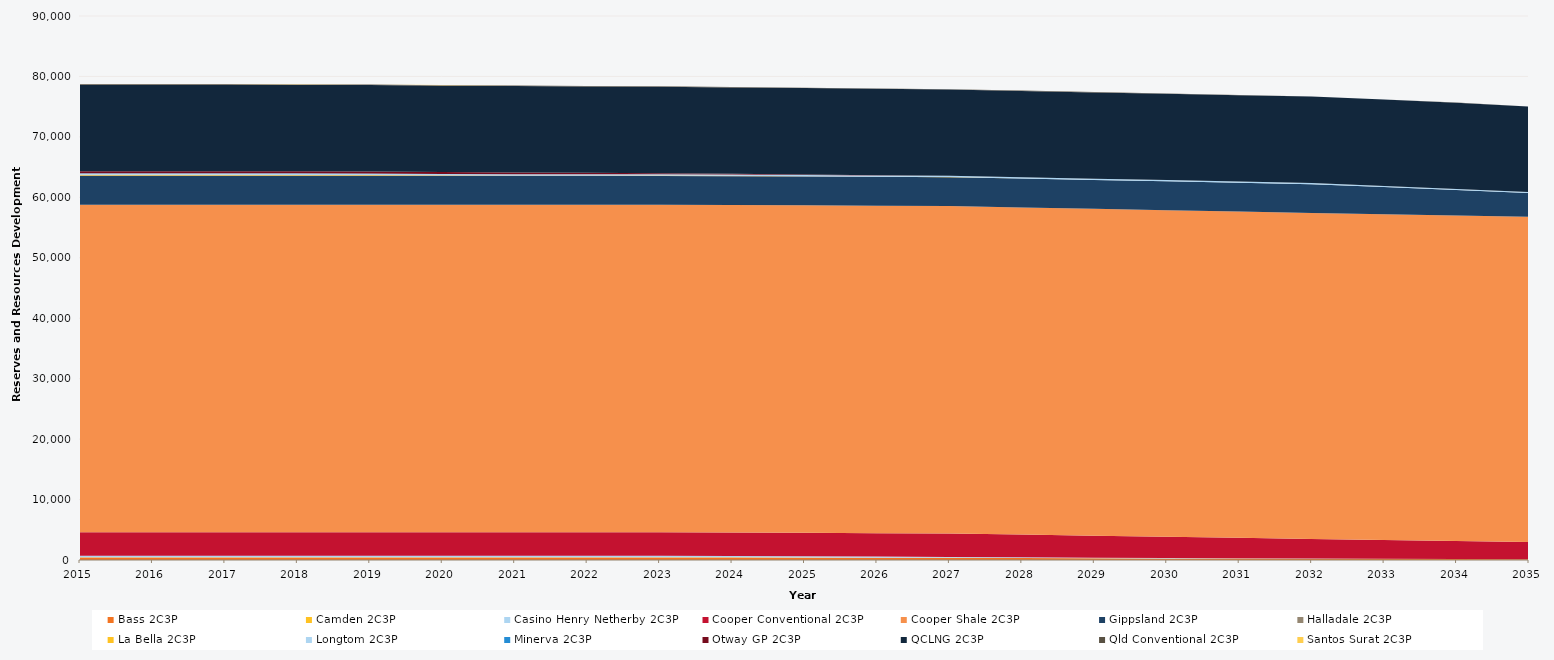
| Category | Bass 2C3P | Camden 2C3P | Casino Henry Netherby 2C3P | Cooper Conventional 2C3P | Cooper Shale 2C3P | Gippsland 2C3P | Halladale 2C3P | La Bella 2C3P | Longtom 2C3P | Minerva 2C3P | Otway GP 2C3P | QCLNG 2C3P | Qld Conventional 2C3P | Santos Surat 2C3P |
|---|---|---|---|---|---|---|---|---|---|---|---|---|---|---|
| 2015.0 | 409.522 | 36 | 273.008 | 3883.683 | 54170.916 | 4777.394 | 44 | 126.4 | 208.266 | 66.247 | 328.425 | 14279 | 88.984 | 30.64 |
| 2016.0 | 409.522 | 36 | 273.008 | 3883.683 | 54170.916 | 4777.394 | 44 | 126.4 | 208.266 | 66.247 | 328.425 | 14279 | 88.984 | 30.64 |
| 2017.0 | 409.522 | 36 | 273.008 | 3883.683 | 54170.916 | 4777.394 | 44 | 126.4 | 208.266 | 66.247 | 328.425 | 14279 | 88.984 | 30.64 |
| 2018.0 | 409.522 | 36 | 273.008 | 3883.683 | 54170.916 | 4777.394 | 44 | 120.433 | 208.266 | 66.247 | 328.425 | 14279 | 88.984 | 30.64 |
| 2019.0 | 409.522 | 36 | 273.008 | 3883.683 | 54170.916 | 4777.394 | 44 | 90.868 | 208.191 | 66.247 | 328.425 | 14279 | 88.984 | 30.64 |
| 2020.0 | 409.522 | 36 | 273.008 | 3883.683 | 54170.916 | 4776.045 | 44 | 61.303 | 208.041 | 0 | 328.425 | 14279 | 88.984 | 20.893 |
| 2021.0 | 409.522 | 36 | 273.008 | 3883.683 | 54170.916 | 4775.524 | 44 | 25.726 | 207.977 | 0 | 295.527 | 14279 | 88.984 | 9.913 |
| 2022.0 | 409.522 | 36 | 273.008 | 3883.683 | 54170.916 | 4775.524 | 44 | 20.002 | 207.869 | 0 | 243.487 | 14279 | 88.984 | 0 |
| 2023.0 | 409.522 | 36 | 264.908 | 3883.683 | 54170.916 | 4774.95 | 39.701 | 16.842 | 207.84 | 0 | 192.979 | 14279 | 88.984 | 0 |
| 2024.0 | 409.522 | 31.695 | 235.708 | 3883.683 | 54170.916 | 4774.95 | 29.155 | 16.265 | 207.802 | 0 | 146.524 | 14279 | 88.396 | 0 |
| 2025.0 | 385.947 | 26.205 | 206.428 | 3883.683 | 54170.916 | 4774.597 | 29.155 | 6.993 | 207.802 | 0 | 98.153 | 14279 | 80.344 | 0 |
| 2026.0 | 361.492 | 20.73 | 177.228 | 3883.683 | 54170.916 | 4774.56 | 16.174 | 6.229 | 207.802 | 0 | 54.284 | 14279 | 72.314 | 0 |
| 2027.0 | 337.037 | 15.255 | 148.028 | 3883.683 | 54170.916 | 4774.56 | 9.819 | 5.399 | 207.606 | 0 | 2.182 | 14279 | 64.284 | 0 |
| 2028.0 | 312.582 | 9.78 | 118.828 | 3765.688 | 54124.435 | 4772.22 | 6.73 | 0 | 207.398 | 0 | 2.182 | 14279 | 56.254 | 0 |
| 2029.0 | 288.06 | 4.29 | 89.548 | 3632.092 | 54081.797 | 4770.395 | 5.868 | 0 | 207.398 | 0 | 2.179 | 14279 | 48.202 | 0 |
| 2030.0 | 263.605 | 2.76 | 73.666 | 3499.652 | 54035.387 | 4770.395 | 3.627 | 0 | 207.377 | 0 | 1.916 | 14279 | 40.172 | 0 |
| 2031.0 | 239.15 | 1.38 | 54.625 | 3374.232 | 53981.957 | 4770.374 | 0 | 0 | 207.377 | 0 | 0.115 | 14279 | 32.142 | 0 |
| 2032.0 | 214.695 | 0 | 33.478 | 3241.012 | 53936.327 | 4756.135 | 0 | 0 | 207.002 | 0 | 0 | 14279 | 24.112 | 0 |
| 2033.0 | 190.173 | 0 | 18.058 | 3103.792 | 53894.207 | 4489.875 | 0 | 0 | 192.811 | 0 | 0 | 14279 | 16.06 | 0 |
| 2034.0 | 165.718 | 0 | 9.555 | 2973.692 | 53845.457 | 4215.754 | 0 | 0 | 176.882 | 0 | 0 | 14279 | 8.03 | 0 |
| 2035.0 | 141.263 | 0 | 0 | 2841.642 | 53798.657 | 3942.75 | 0 | 0 | 160.178 | 0 | 0 | 14147.808 | 0 | 0 |